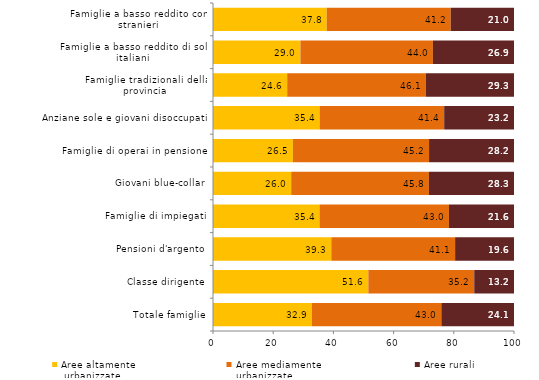
| Category | Aree altamente
 urbanizzate | Aree mediamente 
urbanizzate | Aree rurali |
|---|---|---|---|
| Totale famiglie | 32.851 | 43.023 | 24.126 |
| Classe dirigente | 51.618 | 35.175 | 13.207 |
| Pensioni d'argento | 39.302 | 41.134 | 19.565 |
| Famiglie di impiegati | 35.389 | 42.999 | 21.612 |
| Giovani blue-collar | 25.976 | 45.758 | 28.266 |
| Famiglie di operai in pensione | 26.546 | 45.233 | 28.221 |
| Anziane sole e giovani disoccupati | 35.415 | 41.387 | 23.198 |
| Famiglie tradizionali della provincia | 24.642 | 46.104 | 29.254 |
| Famiglie a basso reddito di soli italiani | 29.046 | 44.015 | 26.939 |
| Famiglie a basso reddito con stranieri | 37.772 | 41.211 | 21.017 |